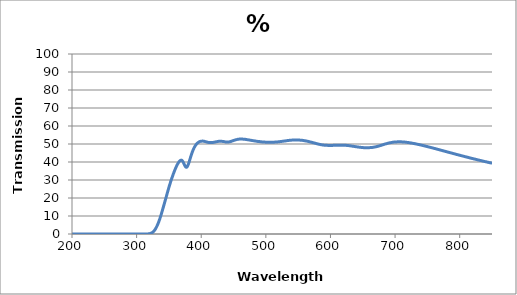
| Category | % Transmission |
|---|---|
| 850.0 | 39.352 |
| 849.0 | 39.409 |
| 848.0 | 39.528 |
| 847.0 | 39.592 |
| 846.0 | 39.655 |
| 845.0 | 39.714 |
| 844.0 | 39.875 |
| 843.0 | 39.891 |
| 842.0 | 40.023 |
| 841.0 | 40.102 |
| 840.0 | 40.169 |
| 839.0 | 40.243 |
| 838.0 | 40.332 |
| 837.0 | 40.403 |
| 836.0 | 40.502 |
| 835.0 | 40.603 |
| 834.0 | 40.677 |
| 833.0 | 40.773 |
| 832.0 | 40.84 |
| 831.0 | 40.926 |
| 830.0 | 41.03 |
| 829.0 | 41.116 |
| 828.0 | 41.172 |
| 827.0 | 41.291 |
| 826.0 | 41.371 |
| 825.0 | 41.468 |
| 824.0 | 41.549 |
| 823.0 | 41.658 |
| 822.0 | 41.715 |
| 821.0 | 41.802 |
| 820.0 | 41.921 |
| 819.0 | 41.969 |
| 818.0 | 42.075 |
| 817.0 | 42.157 |
| 816.0 | 42.254 |
| 815.0 | 42.354 |
| 814.0 | 42.453 |
| 813.0 | 42.547 |
| 812.0 | 42.646 |
| 811.0 | 42.734 |
| 810.0 | 42.815 |
| 809.0 | 42.911 |
| 808.0 | 42.981 |
| 807.0 | 43.113 |
| 806.0 | 43.191 |
| 805.0 | 43.294 |
| 804.0 | 43.378 |
| 803.0 | 43.481 |
| 802.0 | 43.545 |
| 801.0 | 43.649 |
| 800.0 | 43.763 |
| 799.0 | 43.84 |
| 798.0 | 43.944 |
| 797.0 | 44.041 |
| 796.0 | 44.116 |
| 795.0 | 44.215 |
| 794.0 | 44.328 |
| 793.0 | 44.419 |
| 792.0 | 44.529 |
| 791.0 | 44.614 |
| 790.0 | 44.711 |
| 789.0 | 44.806 |
| 788.0 | 44.922 |
| 787.0 | 44.999 |
| 786.0 | 45.106 |
| 785.0 | 45.193 |
| 784.0 | 45.286 |
| 783.0 | 45.394 |
| 782.0 | 45.48 |
| 781.0 | 45.59 |
| 780.0 | 45.678 |
| 779.0 | 45.791 |
| 778.0 | 45.851 |
| 777.0 | 45.977 |
| 776.0 | 46.075 |
| 775.0 | 46.162 |
| 774.0 | 46.267 |
| 773.0 | 46.375 |
| 772.0 | 46.449 |
| 771.0 | 46.55 |
| 770.0 | 46.667 |
| 769.0 | 46.745 |
| 768.0 | 46.859 |
| 767.0 | 46.947 |
| 766.0 | 47.035 |
| 765.0 | 47.138 |
| 764.0 | 47.254 |
| 763.0 | 47.329 |
| 762.0 | 47.435 |
| 761.0 | 47.534 |
| 760.0 | 47.6 |
| 759.0 | 47.715 |
| 758.0 | 47.823 |
| 757.0 | 47.917 |
| 756.0 | 48.009 |
| 755.0 | 48.102 |
| 754.0 | 48.175 |
| 753.0 | 48.276 |
| 752.0 | 48.37 |
| 751.0 | 48.458 |
| 750.0 | 48.56 |
| 749.0 | 48.648 |
| 748.0 | 48.718 |
| 747.0 | 48.817 |
| 746.0 | 48.916 |
| 745.0 | 49.008 |
| 744.0 | 49.097 |
| 743.0 | 49.184 |
| 742.0 | 49.241 |
| 741.0 | 49.351 |
| 740.0 | 49.438 |
| 739.0 | 49.526 |
| 738.0 | 49.607 |
| 737.0 | 49.687 |
| 736.0 | 49.74 |
| 735.0 | 49.849 |
| 734.0 | 49.919 |
| 733.0 | 49.984 |
| 732.0 | 50.065 |
| 731.0 | 50.137 |
| 730.0 | 50.21 |
| 729.0 | 50.298 |
| 728.0 | 50.342 |
| 727.0 | 50.406 |
| 726.0 | 50.493 |
| 725.0 | 50.56 |
| 724.0 | 50.591 |
| 723.0 | 50.66 |
| 722.0 | 50.725 |
| 721.0 | 50.783 |
| 720.0 | 50.837 |
| 719.0 | 50.884 |
| 718.0 | 50.912 |
| 717.0 | 50.966 |
| 716.0 | 51.03 |
| 715.0 | 51.058 |
| 714.0 | 51.087 |
| 713.0 | 51.107 |
| 712.0 | 51.117 |
| 711.0 | 51.163 |
| 710.0 | 51.19 |
| 709.0 | 51.206 |
| 708.0 | 51.22 |
| 707.0 | 51.228 |
| 706.0 | 51.199 |
| 705.0 | 51.215 |
| 704.0 | 51.213 |
| 703.0 | 51.174 |
| 702.0 | 51.178 |
| 701.0 | 51.134 |
| 700.0 | 51.104 |
| 699.0 | 51.087 |
| 698.0 | 51.048 |
| 697.0 | 50.999 |
| 696.0 | 50.943 |
| 695.0 | 50.874 |
| 694.0 | 50.788 |
| 693.0 | 50.752 |
| 692.0 | 50.689 |
| 691.0 | 50.598 |
| 690.0 | 50.526 |
| 689.0 | 50.426 |
| 688.0 | 50.318 |
| 687.0 | 50.197 |
| 686.0 | 50.131 |
| 685.0 | 50.03 |
| 684.0 | 49.903 |
| 683.0 | 49.805 |
| 682.0 | 49.674 |
| 681.0 | 49.561 |
| 680.0 | 49.462 |
| 679.0 | 49.344 |
| 678.0 | 49.213 |
| 677.0 | 49.108 |
| 676.0 | 48.996 |
| 675.0 | 48.887 |
| 674.0 | 48.793 |
| 673.0 | 48.7 |
| 672.0 | 48.6 |
| 671.0 | 48.518 |
| 670.0 | 48.43 |
| 669.0 | 48.355 |
| 668.0 | 48.31 |
| 667.0 | 48.232 |
| 666.0 | 48.159 |
| 665.0 | 48.114 |
| 664.0 | 48.066 |
| 663.0 | 48.025 |
| 662.0 | 47.999 |
| 661.0 | 47.989 |
| 660.0 | 47.966 |
| 659.0 | 47.949 |
| 658.0 | 47.926 |
| 657.0 | 47.911 |
| 656.0 | 47.923 |
| 655.0 | 47.936 |
| 654.0 | 47.94 |
| 653.0 | 47.949 |
| 652.0 | 47.956 |
| 651.0 | 47.976 |
| 650.0 | 48.026 |
| 649.0 | 48.055 |
| 648.0 | 48.077 |
| 647.0 | 48.121 |
| 646.0 | 48.157 |
| 645.0 | 48.201 |
| 644.0 | 48.254 |
| 643.0 | 48.315 |
| 642.0 | 48.355 |
| 641.0 | 48.41 |
| 640.0 | 48.463 |
| 639.0 | 48.517 |
| 638.0 | 48.587 |
| 637.0 | 48.627 |
| 636.0 | 48.685 |
| 635.0 | 48.752 |
| 634.0 | 48.799 |
| 633.0 | 48.849 |
| 632.0 | 48.909 |
| 631.0 | 48.977 |
| 630.0 | 49.016 |
| 629.0 | 49.065 |
| 628.0 | 49.106 |
| 627.0 | 49.152 |
| 626.0 | 49.203 |
| 625.0 | 49.222 |
| 624.0 | 49.257 |
| 623.0 | 49.281 |
| 622.0 | 49.292 |
| 621.0 | 49.324 |
| 620.0 | 49.344 |
| 619.0 | 49.334 |
| 618.0 | 49.338 |
| 617.0 | 49.346 |
| 616.0 | 49.332 |
| 615.0 | 49.331 |
| 614.0 | 49.33 |
| 613.0 | 49.33 |
| 612.0 | 49.319 |
| 611.0 | 49.322 |
| 610.0 | 49.305 |
| 609.0 | 49.286 |
| 608.0 | 49.286 |
| 607.0 | 49.28 |
| 606.0 | 49.269 |
| 605.0 | 49.256 |
| 604.0 | 49.234 |
| 603.0 | 49.22 |
| 602.0 | 49.232 |
| 601.0 | 49.222 |
| 600.0 | 49.223 |
| 599.0 | 49.234 |
| 598.0 | 49.218 |
| 597.0 | 49.215 |
| 596.0 | 49.229 |
| 595.0 | 49.239 |
| 594.0 | 49.241 |
| 593.0 | 49.267 |
| 592.0 | 49.283 |
| 591.0 | 49.308 |
| 590.0 | 49.368 |
| 589.0 | 49.41 |
| 588.0 | 49.449 |
| 587.0 | 49.523 |
| 586.0 | 49.577 |
| 585.0 | 49.647 |
| 584.0 | 49.735 |
| 583.0 | 49.808 |
| 582.0 | 49.885 |
| 581.0 | 49.979 |
| 580.0 | 50.062 |
| 579.0 | 50.158 |
| 578.0 | 50.256 |
| 577.0 | 50.364 |
| 576.0 | 50.466 |
| 575.0 | 50.554 |
| 574.0 | 50.651 |
| 573.0 | 50.732 |
| 572.0 | 50.848 |
| 571.0 | 50.94 |
| 570.0 | 51.015 |
| 569.0 | 51.126 |
| 568.0 | 51.199 |
| 567.0 | 51.284 |
| 566.0 | 51.394 |
| 565.0 | 51.475 |
| 564.0 | 51.549 |
| 563.0 | 51.631 |
| 562.0 | 51.677 |
| 561.0 | 51.762 |
| 560.0 | 51.799 |
| 559.0 | 51.876 |
| 558.0 | 51.939 |
| 557.0 | 52.008 |
| 556.0 | 52.045 |
| 555.0 | 52.081 |
| 554.0 | 52.101 |
| 553.0 | 52.133 |
| 552.0 | 52.174 |
| 551.0 | 52.201 |
| 550.0 | 52.221 |
| 549.0 | 52.23 |
| 548.0 | 52.223 |
| 547.0 | 52.236 |
| 546.0 | 52.273 |
| 545.0 | 52.237 |
| 544.0 | 52.218 |
| 543.0 | 52.212 |
| 542.0 | 52.165 |
| 541.0 | 52.174 |
| 540.0 | 52.149 |
| 539.0 | 52.129 |
| 538.0 | 52.089 |
| 537.0 | 52.047 |
| 536.0 | 52.008 |
| 535.0 | 51.963 |
| 534.0 | 51.942 |
| 533.0 | 51.878 |
| 532.0 | 51.827 |
| 531.0 | 51.771 |
| 530.0 | 51.695 |
| 529.0 | 51.659 |
| 528.0 | 51.625 |
| 527.0 | 51.549 |
| 526.0 | 51.515 |
| 525.0 | 51.47 |
| 524.0 | 51.395 |
| 523.0 | 51.359 |
| 522.0 | 51.326 |
| 521.0 | 51.279 |
| 520.0 | 51.238 |
| 519.0 | 51.207 |
| 518.0 | 51.154 |
| 517.0 | 51.123 |
| 516.0 | 51.114 |
| 515.0 | 51.074 |
| 514.0 | 51.059 |
| 513.0 | 51.022 |
| 512.0 | 50.991 |
| 511.0 | 50.996 |
| 510.0 | 50.98 |
| 509.0 | 50.961 |
| 508.0 | 50.958 |
| 507.0 | 50.954 |
| 506.0 | 50.934 |
| 505.0 | 50.954 |
| 504.0 | 51.017 |
| 503.0 | 50.941 |
| 502.0 | 50.998 |
| 501.0 | 50.997 |
| 500.0 | 51.007 |
| 499.0 | 51.033 |
| 498.0 | 51.098 |
| 497.0 | 51.075 |
| 496.0 | 51.139 |
| 495.0 | 51.156 |
| 494.0 | 51.153 |
| 493.0 | 51.207 |
| 492.0 | 51.262 |
| 491.0 | 51.278 |
| 490.0 | 51.361 |
| 489.0 | 51.351 |
| 488.0 | 51.414 |
| 487.0 | 51.456 |
| 486.0 | 51.529 |
| 485.0 | 51.565 |
| 484.0 | 51.622 |
| 483.0 | 51.686 |
| 482.0 | 51.738 |
| 481.0 | 51.801 |
| 480.0 | 51.868 |
| 479.0 | 51.895 |
| 478.0 | 51.987 |
| 477.0 | 52.055 |
| 476.0 | 52.098 |
| 475.0 | 52.172 |
| 474.0 | 52.25 |
| 473.0 | 52.298 |
| 472.0 | 52.368 |
| 471.0 | 52.417 |
| 470.0 | 52.466 |
| 469.0 | 52.512 |
| 468.0 | 52.611 |
| 467.0 | 52.612 |
| 466.0 | 52.696 |
| 465.0 | 52.693 |
| 464.0 | 52.719 |
| 463.0 | 52.745 |
| 462.0 | 52.765 |
| 461.0 | 52.775 |
| 460.0 | 52.733 |
| 459.0 | 52.739 |
| 458.0 | 52.654 |
| 457.0 | 52.623 |
| 456.0 | 52.581 |
| 455.0 | 52.449 |
| 454.0 | 52.408 |
| 453.0 | 52.282 |
| 452.0 | 52.183 |
| 451.0 | 52.054 |
| 450.0 | 51.958 |
| 449.0 | 51.819 |
| 448.0 | 51.686 |
| 447.0 | 51.582 |
| 446.0 | 51.407 |
| 445.0 | 51.343 |
| 444.0 | 51.233 |
| 443.0 | 51.156 |
| 442.0 | 51.086 |
| 441.0 | 51.056 |
| 440.0 | 51.048 |
| 439.0 | 51.064 |
| 438.0 | 51.157 |
| 437.0 | 51.173 |
| 436.0 | 51.295 |
| 435.0 | 51.333 |
| 434.0 | 51.407 |
| 433.0 | 51.438 |
| 432.0 | 51.476 |
| 431.0 | 51.471 |
| 430.0 | 51.482 |
| 429.0 | 51.545 |
| 428.0 | 51.493 |
| 427.0 | 51.49 |
| 426.0 | 51.429 |
| 425.0 | 51.349 |
| 424.0 | 51.286 |
| 423.0 | 51.222 |
| 422.0 | 51.124 |
| 421.0 | 51.063 |
| 420.0 | 50.987 |
| 419.0 | 50.925 |
| 418.0 | 50.865 |
| 417.0 | 50.82 |
| 416.0 | 50.774 |
| 415.0 | 50.772 |
| 414.0 | 50.802 |
| 413.0 | 50.774 |
| 412.0 | 50.849 |
| 411.0 | 50.896 |
| 410.0 | 50.955 |
| 409.0 | 51.067 |
| 408.0 | 51.162 |
| 407.0 | 51.271 |
| 406.0 | 51.36 |
| 405.0 | 51.482 |
| 404.0 | 51.514 |
| 403.0 | 51.605 |
| 402.0 | 51.639 |
| 401.0 | 51.582 |
| 400.0 | 51.577 |
| 399.0 | 51.49 |
| 398.0 | 51.386 |
| 397.0 | 51.2 |
| 396.0 | 51.016 |
| 395.0 | 50.727 |
| 394.0 | 50.441 |
| 393.0 | 50.08 |
| 392.0 | 49.636 |
| 391.0 | 49.156 |
| 390.0 | 48.558 |
| 389.0 | 47.913 |
| 388.0 | 47.144 |
| 387.0 | 46.295 |
| 386.0 | 45.328 |
| 385.0 | 44.318 |
| 384.0 | 43.219 |
| 383.0 | 42.052 |
| 382.0 | 40.898 |
| 381.0 | 39.741 |
| 380.0 | 38.715 |
| 379.0 | 37.869 |
| 378.0 | 37.247 |
| 377.0 | 37.054 |
| 376.0 | 37.245 |
| 375.0 | 37.757 |
| 374.0 | 38.464 |
| 373.0 | 39.255 |
| 372.0 | 39.982 |
| 371.0 | 40.55 |
| 370.0 | 40.914 |
| 369.0 | 41.051 |
| 368.0 | 40.924 |
| 367.0 | 40.69 |
| 366.0 | 40.282 |
| 365.0 | 39.779 |
| 364.0 | 39.221 |
| 363.0 | 38.574 |
| 362.0 | 37.848 |
| 361.0 | 37.093 |
| 360.0 | 36.27 |
| 359.0 | 35.392 |
| 358.0 | 34.476 |
| 357.0 | 33.533 |
| 356.0 | 32.509 |
| 355.0 | 31.5 |
| 354.0 | 30.448 |
| 353.0 | 29.365 |
| 352.0 | 28.258 |
| 351.0 | 27.114 |
| 350.0 | 25.911 |
| 349.0 | 24.683 |
| 348.0 | 23.415 |
| 347.0 | 22.129 |
| 346.0 | 20.85 |
| 345.0 | 19.576 |
| 344.0 | 18.287 |
| 343.0 | 17.026 |
| 342.0 | 15.759 |
| 341.0 | 14.5 |
| 340.0 | 13.246 |
| 339.0 | 12.018 |
| 338.0 | 10.803 |
| 337.0 | 9.634 |
| 336.0 | 8.528 |
| 335.0 | 7.491 |
| 334.0 | 6.523 |
| 333.0 | 5.628 |
| 332.0 | 4.797 |
| 331.0 | 4.037 |
| 330.0 | 3.343 |
| 329.0 | 2.726 |
| 328.0 | 2.183 |
| 327.0 | 1.721 |
| 326.0 | 1.334 |
| 325.0 | 1.016 |
| 324.0 | 0.758 |
| 323.0 | 0.555 |
| 322.0 | 0.394 |
| 321.0 | 0.276 |
| 320.0 | 0.186 |
| 319.0 | 0.122 |
| 318.0 | 0.076 |
| 317.0 | 0.047 |
| 316.0 | 0.027 |
| 315.0 | 0.014 |
| 314.0 | 0.009 |
| 313.0 | 0.004 |
| 312.0 | 0.002 |
| 311.0 | 0.001 |
| 310.0 | 0.001 |
| 309.0 | 0.001 |
| 308.0 | 0 |
| 307.0 | 0.002 |
| 306.0 | 0.002 |
| 305.0 | 0.001 |
| 304.0 | 0 |
| 303.0 | 0.001 |
| 302.0 | 0.001 |
| 301.0 | 0 |
| 300.0 | 0.001 |
| 299.0 | 0 |
| 298.0 | 0.002 |
| 297.0 | 0.001 |
| 296.0 | 0.001 |
| 295.0 | 0.001 |
| 294.0 | 0.001 |
| 293.0 | 0 |
| 292.0 | 0.001 |
| 291.0 | 0 |
| 290.0 | 0.002 |
| 289.0 | 0 |
| 288.0 | 0.001 |
| 287.0 | 0 |
| 286.0 | 0.002 |
| 285.0 | 0.001 |
| 284.0 | 0.001 |
| 283.0 | 0.001 |
| 282.0 | 0 |
| 281.0 | 0.001 |
| 280.0 | 0.002 |
| 279.0 | 0 |
| 278.0 | 0.001 |
| 277.0 | 0 |
| 276.0 | 0.001 |
| 275.0 | 0 |
| 274.0 | 0.001 |
| 273.0 | 0.001 |
| 272.0 | 0.001 |
| 271.0 | 0 |
| 270.0 | 0.002 |
| 269.0 | 0 |
| 268.0 | 0.002 |
| 267.0 | 0 |
| 266.0 | 0 |
| 265.0 | 0 |
| 264.0 | 0.001 |
| 263.0 | 0.001 |
| 262.0 | 0.002 |
| 261.0 | 0 |
| 260.0 | 0 |
| 259.0 | 0.001 |
| 258.0 | 0.001 |
| 257.0 | 0.001 |
| 256.0 | 0.002 |
| 255.0 | 0 |
| 254.0 | 0 |
| 253.0 | 0 |
| 252.0 | 0.002 |
| 251.0 | 0.001 |
| 250.0 | 0.001 |
| 249.0 | 0 |
| 248.0 | 0.001 |
| 247.0 | 0.001 |
| 246.0 | 0.001 |
| 245.0 | 0 |
| 244.0 | 0.002 |
| 243.0 | 0.001 |
| 242.0 | 0 |
| 241.0 | 0 |
| 240.0 | 0.001 |
| 239.0 | 0 |
| 238.0 | 0.002 |
| 237.0 | 0 |
| 236.0 | 0 |
| 235.0 | 0 |
| 234.0 | 0.002 |
| 233.0 | 0 |
| 232.0 | 0 |
| 231.0 | 0.001 |
| 230.0 | 0.002 |
| 229.0 | 0.001 |
| 228.0 | 0.002 |
| 227.0 | 0 |
| 226.0 | 0.001 |
| 225.0 | 0.001 |
| 224.0 | 0.001 |
| 223.0 | 0 |
| 222.0 | 0.001 |
| 221.0 | 0 |
| 220.0 | 0.001 |
| 219.0 | 0.001 |
| 218.0 | 0.001 |
| 217.0 | 0 |
| 216.0 | 0.001 |
| 215.0 | 0 |
| 214.0 | 0.001 |
| 213.0 | 0 |
| 212.0 | 0.001 |
| 211.0 | 0.001 |
| 210.0 | 0.002 |
| 209.0 | 0.001 |
| 208.0 | 0.002 |
| 207.0 | 0.002 |
| 206.0 | 0.001 |
| 205.0 | 0.001 |
| 204.0 | 0.002 |
| 203.0 | 0.001 |
| 202.0 | 0.001 |
| 201.0 | 0.001 |
| 200.0 | 0 |